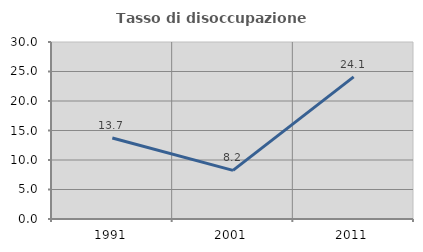
| Category | Tasso di disoccupazione giovanile  |
|---|---|
| 1991.0 | 13.738 |
| 2001.0 | 8.245 |
| 2011.0 | 24.09 |